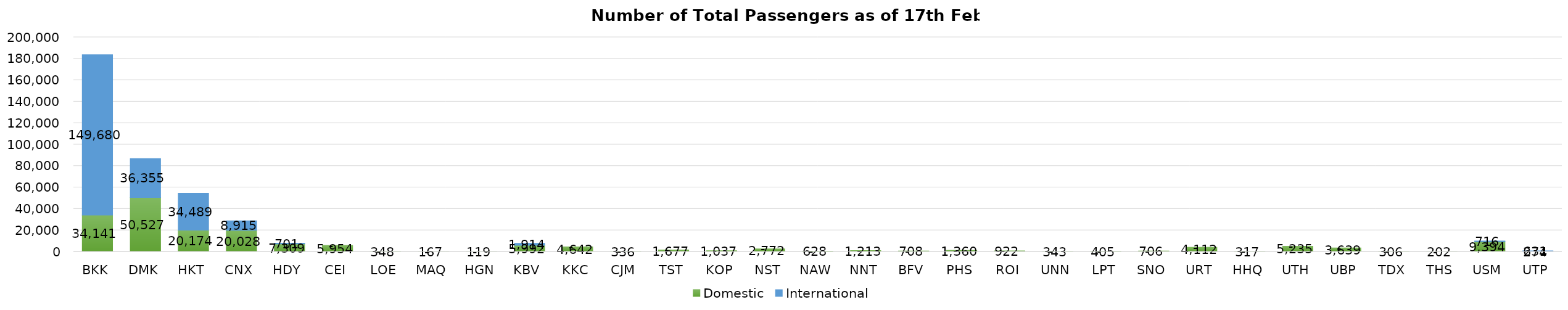
| Category | Domestic | International |
|---|---|---|
| BKK | 34141 | 149680 |
| DMK | 50527 | 36355 |
| HKT | 20174 | 34489 |
| CNX | 20028 | 8915 |
| HDY | 7309 | 701 |
| CEI | 5954 | 0 |
| LOE | 348 | 0 |
| MAQ | 167 | 0 |
| HGN | 119 | 0 |
| KBV | 5992 | 1914 |
| KKC | 4642 | 0 |
| CJM | 336 | 0 |
| TST | 1677 | 0 |
| KOP | 1037 | 0 |
| NST | 2772 | 0 |
| NAW | 628 | 0 |
| NNT | 1213 | 0 |
| BFV | 708 | 0 |
| PHS | 1360 | 0 |
| ROI | 922 | 0 |
| UNN | 343 | 0 |
| LPT | 405 | 0 |
| SNO | 706 | 0 |
| URT | 4112 | 0 |
| HHQ | 317 | 0 |
| UTH | 5235 | 0 |
| UBP | 3639 | 0 |
| TDX | 306 | 0 |
| THS | 202 | 0 |
| USM | 9394 | 716 |
| UTP | 274 | 631 |